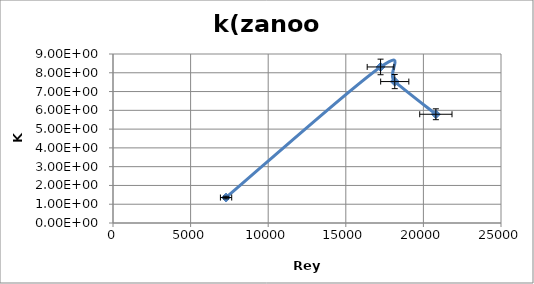
| Category | Series 0 |
|---|---|
| 20803.015094783164 | 5.791 |
| 18153.81690274741 | 7.532 |
| 17240.26998764141 | 8.311 |
| 7284.927523308795 | 1.356 |